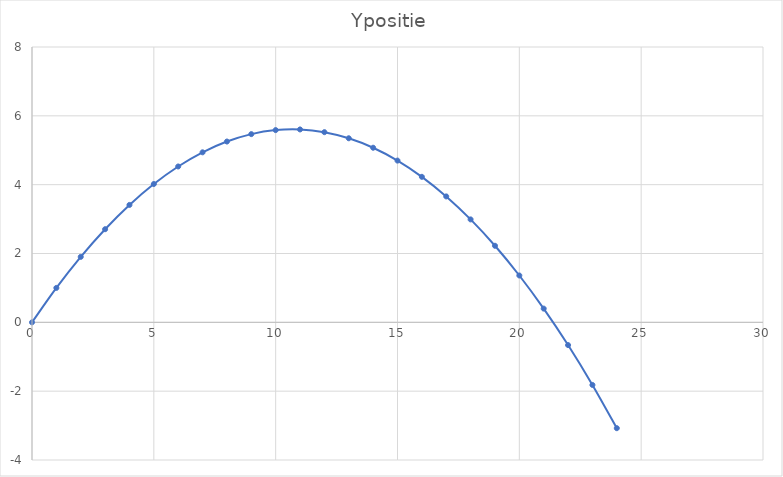
| Category | Ypositie |
|---|---|
| 0.0 | 0 |
| 1.0 | 1 |
| 2.0 | 1.902 |
| 3.0 | 2.706 |
| 4.0 | 3.411 |
| 5.0 | 4.019 |
| 6.0 | 4.528 |
| 7.0 | 4.94 |
| 8.0 | 5.253 |
| 9.0 | 5.468 |
| 10.0 | 5.586 |
| 11.0 | 5.605 |
| 12.0 | 5.525 |
| 13.0 | 5.348 |
| 14.0 | 5.073 |
| 15.0 | 4.7 |
| 16.0 | 4.228 |
| 17.0 | 3.658 |
| 18.0 | 2.991 |
| 19.0 | 2.225 |
| 20.0 | 1.361 |
| 21.0 | 0.399 |
| 22.0 | -0.661 |
| 23.0 | -1.819 |
| 24.0 | -3.076 |